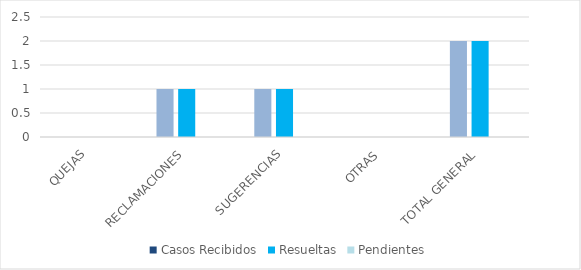
| Category | Casos Recibidos | Resueltas | Pendientes |
|---|---|---|---|
| QUEJAS | 0 | 0 | 0 |
| RECLAMACIONES | 1 | 1 | 0 |
| SUGERENCIAS | 1 | 1 | 0 |
| OTRAS | 0 | 0 | 0 |
| TOTAL GENERAL | 2 | 2 | 0 |